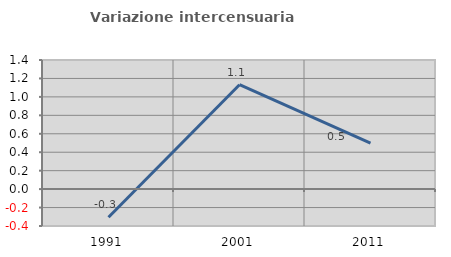
| Category | Variazione intercensuaria annua |
|---|---|
| 1991.0 | -0.306 |
| 2001.0 | 1.132 |
| 2011.0 | 0.498 |